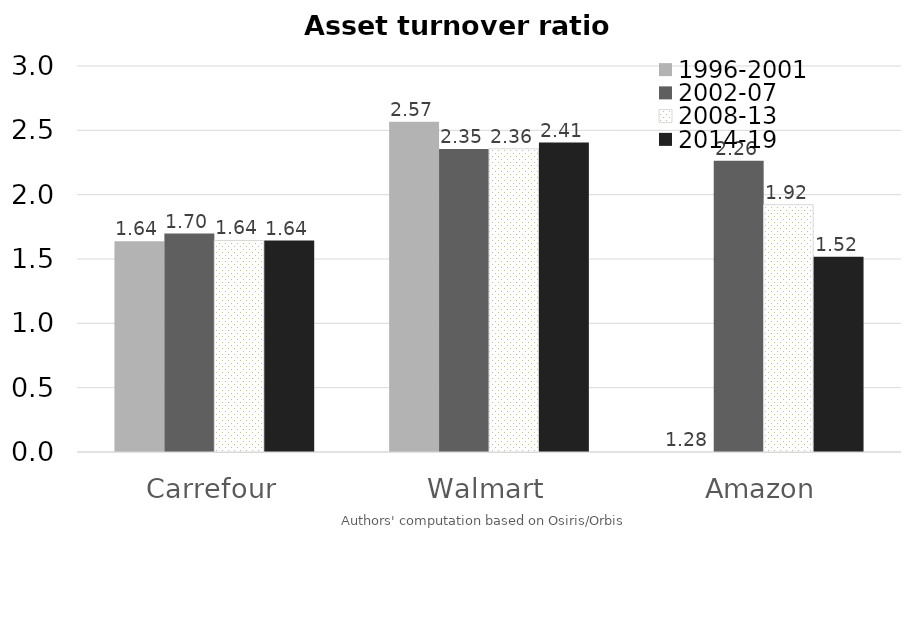
| Category | 1996-2001 | 2002-07 | 2008-13 | 2014-19 |
|---|---|---|---|---|
| Carrefour | 1.637 | 1.698 | 1.644 | 1.643 |
| Walmart | 2.567 | 2.354 | 2.357 | 2.405 |
| Amazon | 1.283 | 2.263 | 1.922 | 1.517 |